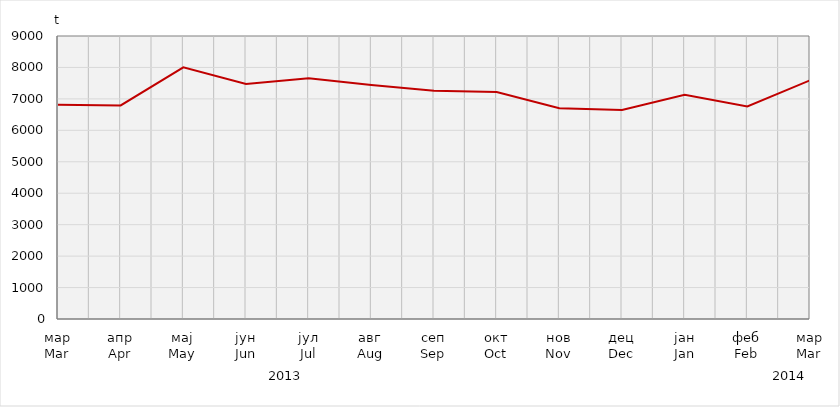
| Category | Series 0 |
|---|---|
| мар
Mar | 6817.539 |
| апр
Apr | 6791.082 |
| мај
May | 8003.083 |
| јун
Jun | 7477.208 |
| јул
Jul | 7656.3 |
| авг
Aug | 7438.817 |
| сеп
Sep | 7259.483 |
| окт
Oct | 7215.835 |
| нов
Nov | 6703.771 |
| дец
Dec | 6645.141 |
| јан
Jan | 7129.979 |
| феб
Feb | 6759.17 |
| мар
Mar | 7591.3 |